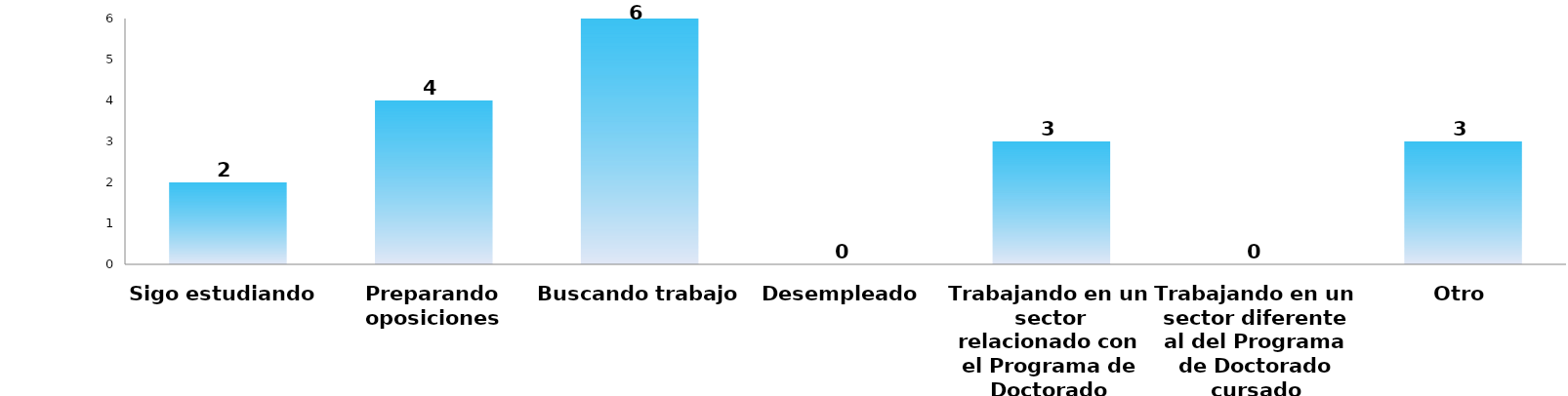
| Category | Series 0 |
|---|---|
| Sigo estudiando | 2 |
| Preparando oposiciones | 4 |
| Buscando trabajo | 6 |
| Desempleado | 0 |
| Trabajando en un sector relacionado con el Programa de Doctorado cursado | 3 |
| Trabajando en un sector diferente al del Programa de Doctorado cursado | 0 |
| Otro | 3 |